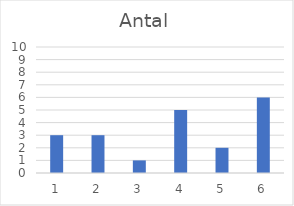
| Category | Antal |
|---|---|
| 1.0 | 3 |
| 2.0 | 3 |
| 3.0 | 1 |
| 4.0 | 5 |
| 5.0 | 2 |
| 6.0 | 6 |